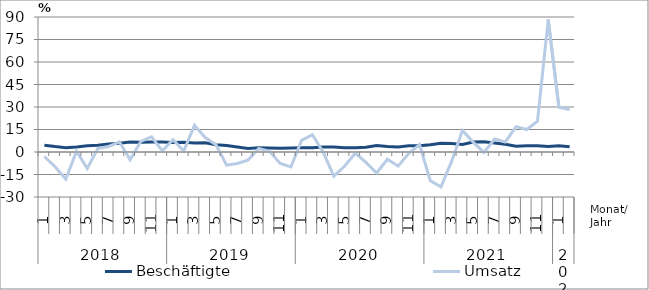
| Category | Beschäftigte | Umsatz |
|---|---|---|
| 0 | 4.5 | -3 |
| 1 | 3.6 | -9.8 |
| 2 | 2.9 | -18.1 |
| 3 | 3.4 | 0.5 |
| 4 | 4.2 | -11 |
| 5 | 4.5 | 2.5 |
| 6 | 5.3 | 3.7 |
| 7 | 5.8 | 6.8 |
| 8 | 6.6 | -5.2 |
| 9 | 6.5 | 7.1 |
| 10 | 6.6 | 10.1 |
| 11 | 6.6 | 0.8 |
| 12 | 6.4 | 8.2 |
| 13 | 6.5 | 0.6 |
| 14 | 6 | 17.8 |
| 15 | 6.1 | 9.6 |
| 16 | 4.9 | 4.9 |
| 17 | 4.3 | -8.8 |
| 18 | 3.3 | -7.7 |
| 19 | 2.4 | -5.4 |
| 20 | 2.8 | 2.4 |
| 21 | 2.7 | 0.5 |
| 22 | 2.5 | -7.6 |
| 23 | 2.7 | -10 |
| 24 | 2.9 | 7.8 |
| 25 | 2.9 | 11.5 |
| 26 | 3.4 | 0.1 |
| 27 | 3.4 | -16.1 |
| 28 | 2.9 | -9.5 |
| 29 | 2.9 | -0.8 |
| 30 | 3.1 | -6.9 |
| 31 | 4.3 | -14 |
| 32 | 3.6 | -4.9 |
| 33 | 3.4 | -9.4 |
| 34 | 4.1 | -0.9 |
| 35 | 4.1 | 4.9 |
| 36 | 4.8 | -19.1 |
| 37 | 5.8 | -23.3 |
| 38 | 5.6 | -6.1 |
| 39 | 5 | 14.4 |
| 40 | 6.6 | 6.6 |
| 41 | 6.9 | -0.3 |
| 42 | 6 | 8.7 |
| 43 | 5.2 | 6.7 |
| 44 | 3.8 | 16.9 |
| 45 | 4.2 | 15 |
| 46 | 4.2 | 20.6 |
| 47 | 3.6 | 88.3 |
| 48 | 4.2 | 29.8 |
| 49 | 3.5 | 28.3 |